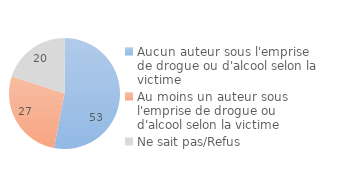
| Category | Series 0 |
|---|---|
| Aucun auteur sous l'emprise de drogue ou d'alcool selon la victime | 53.016 |
| Au moins un auteur sous l'emprise de drogue ou d'alcool selon la victime | 27.012 |
| Ne sait pas/Refus | 19.971 |